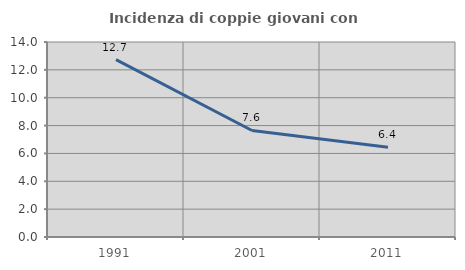
| Category | Incidenza di coppie giovani con figli |
|---|---|
| 1991.0 | 12.739 |
| 2001.0 | 7.648 |
| 2011.0 | 6.445 |